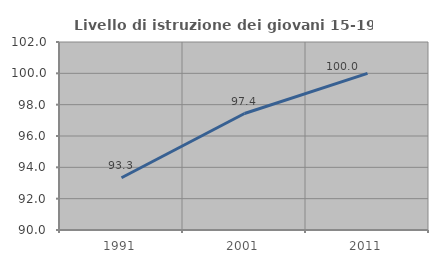
| Category | Livello di istruzione dei giovani 15-19 anni |
|---|---|
| 1991.0 | 93.333 |
| 2001.0 | 97.436 |
| 2011.0 | 100 |